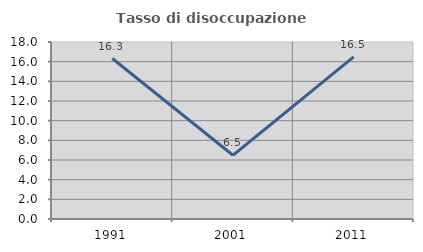
| Category | Tasso di disoccupazione giovanile  |
|---|---|
| 1991.0 | 16.322 |
| 2001.0 | 6.481 |
| 2011.0 | 16.479 |